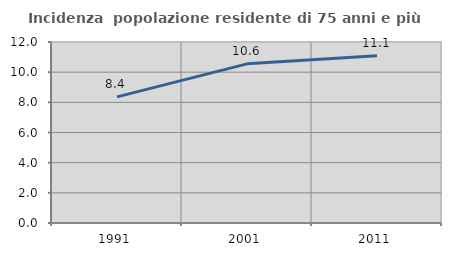
| Category | Incidenza  popolazione residente di 75 anni e più |
|---|---|
| 1991.0 | 8.36 |
| 2001.0 | 10.552 |
| 2011.0 | 11.092 |